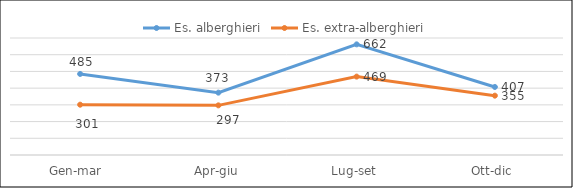
| Category | Es. alberghieri | Es. extra-alberghieri |
|---|---|---|
| Gen-mar  | 485 | 301 |
| Apr-giu | 373 | 297 |
| Lug-set | 662 | 469 |
| Ott-dic | 407 | 355 |